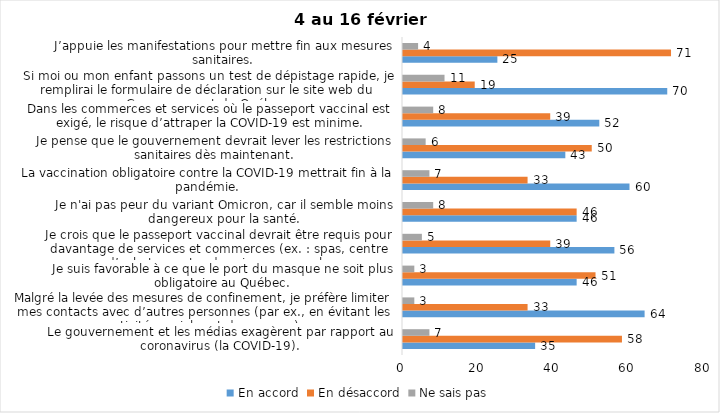
| Category | En accord | En désaccord | Ne sais pas |
|---|---|---|---|
| Le gouvernement et les médias exagèrent par rapport au coronavirus (la COVID-19). | 35 | 58 | 7 |
| Malgré la levée des mesures de confinement, je préfère limiter mes contacts avec d’autres personnes (par ex., en évitant les activités sociales et de groupes) | 64 | 33 | 3 |
| Je suis favorable à ce que le port du masque ne soit plus obligatoire au Québec. | 46 | 51 | 3 |
| Je crois que le passeport vaccinal devrait être requis pour davantage de services et commerces (ex. : spas, centre d’achats, centre de soins personnels. | 56 | 39 | 5 |
| Je n'ai pas peur du variant Omicron, car il semble moins dangereux pour la santé. | 46 | 46 | 8 |
| La vaccination obligatoire contre la COVID-19 mettrait fin à la pandémie. | 60 | 33 | 7 |
| Je pense que le gouvernement devrait lever les restrictions sanitaires dès maintenant. | 43 | 50 | 6 |
| Dans les commerces et services où le passeport vaccinal est exigé, le risque d’attraper la COVID-19 est minime. | 52 | 39 | 8 |
| Si moi ou mon enfant passons un test de dépistage rapide, je remplirai le formulaire de déclaration sur le site web du Gouvernement du Québec. | 70 | 19 | 11 |
| J’appuie les manifestations pour mettre fin aux mesures sanitaires. | 25 | 71 | 4 |